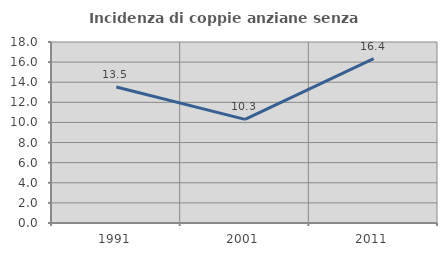
| Category | Incidenza di coppie anziane senza figli  |
|---|---|
| 1991.0 | 13.529 |
| 2001.0 | 10.303 |
| 2011.0 | 16.352 |